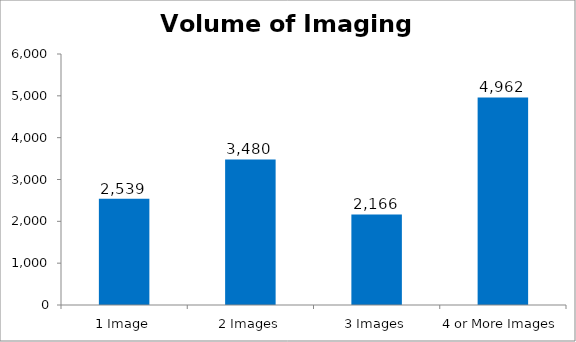
| Category | Total |
|---|---|
| 1 Image | 2539 |
| 2 Images | 3480 |
| 3 Images | 2166 |
| 4 or More Images | 4962 |